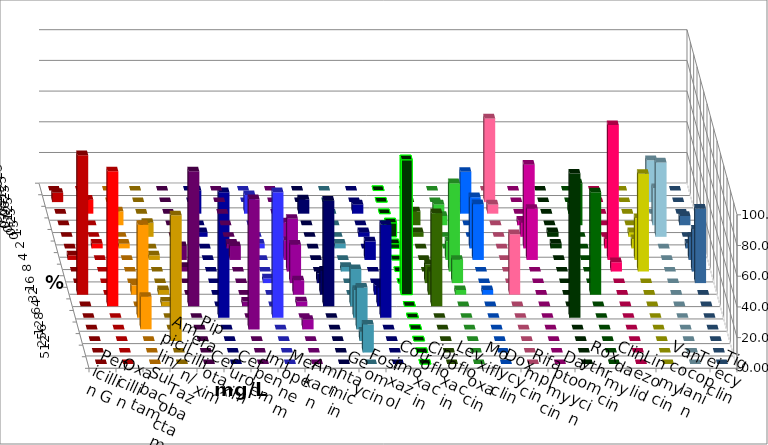
| Category | Penicillin G | Oxacillin | Ampicillin/ Sulbactam | Piperacillin/ Tazobactam | Cefotaxim | Cefuroxim | Imipenem | Meropenem | Amikacin | Gentamicin | Fosfomycin | Cotrimoxazol | Ciprofloxacin | Levofloxacin | Moxifloxacin | Doxycyclin | Rifampicin | Daptomycin | Roxythromycin | Clindamycin | Linezolid | Vancomycin | Teicoplanin | Tigecyclin |
|---|---|---|---|---|---|---|---|---|---|---|---|---|---|---|---|---|---|---|---|---|---|---|---|---|
| 0.015625 | 0 | 0 | 0 | 0 | 0 | 0 | 0 | 0 | 0 | 0 | 0 | 0 | 0 | 0 | 0 | 0 | 0 | 0 | 0 | 0 | 0 | 0 | 0 | 0 |
| 0.03125 | 6.061 | 0 | 0 | 0 | 0 | 0 | 0 | 0 | 0 | 0 | 0 | 0 | 0 | 0 | 0 | 0 | 54.545 | 0 | 0 | 0 | 0 | 0 | 0 | 27.273 |
| 0.0625 | 0 | 9.091 | 0 | 0 | 0 | 0 | 15.152 | 12.121 | 0 | 9.375 | 0 | 6.061 | 0 | 0 | 6.061 | 27.273 | 6.061 | 0 | 0 | 6.061 | 0 | 0 | 0 | 0 |
| 0.125 | 0 | 0 | 9.091 | 0 | 0 | 0 | 0 | 0 | 0 | 0 | 0 | 0 | 0 | 9.091 | 6.061 | 0 | 0 | 3.03 | 0 | 27.273 | 0 | 0 | 6.061 | 24.242 |
| 0.25 | 0 | 0 | 0 | 9.091 | 0 | 0 | 3.03 | 0 | 9.375 | 0 | 0 | 3.03 | 9.091 | 3.03 | 0 | 0 | 0 | 9.091 | 3.03 | 0 | 0 | 3.03 | 0 | 48.485 |
| 0.5 | 0 | 3.03 | 3.03 | 0 | 0 | 3.03 | 0 | 3.03 | 0 | 0 | 3.03 | 0 | 3.03 | 0 | 0 | 33.333 | 0 | 54.545 | 3.03 | 0 | 6.061 | 6.061 | 3.03 | 0 |
| 1.0 | 3.03 | 0 | 0 | 3.03 | 9.091 | 9.091 | 0 | 0 | 12.5 | 0 | 0 | 12.121 | 0 | 0 | 12.121 | 36.364 | 0 | 33.333 | 0 | 0 | 87.879 | 27.273 | 15.152 | 0 |
| 2.0 | 0 | 0 | 0 | 0 | 3.03 | 0 | 0 | 0 | 34.375 | 0 | 3.03 | 0 | 0 | 0 | 57.576 | 0 | 0 | 0 | 0 | 0 | 6.061 | 63.636 | 27.273 | 0 |
| 4.0 | 0 | 0 | 0 | 0 | 0 | 0 | 0 | 3.03 | 25 | 6.25 | 0 | 0 | 0 | 12.121 | 15.152 | 0 | 0 | 0 | 0 | 0 | 0 | 0 | 48.485 | 0 |
| 8.0 | 90.909 | 0 | 6.061 | 3.03 | 0 | 0 | 0 | 0 | 9.375 | 15.625 | 0 | 6.061 | 87.879 | 15.152 | 3.03 | 3.03 | 39.394 | 0 | 0 | 66.667 | 0 | 0 | 0 | 0 |
| 16.0 | 0 | 87.879 | 0 | 3.03 | 87.879 | 3.03 | 0 | 0 | 3.125 | 68.75 | 24.242 | 12.121 | 0 | 60.606 | 0 | 0 | 0 | 0 | 0 | 0 | 0 | 0 | 0 | 0 |
| 32.0 | 0 | 0 | 60.606 | 0 | 0 | 0 | 81.818 | 81.818 | 0 | 0 | 18.182 | 60.606 | 0 | 0 | 0 | 0 | 0 | 0 | 93.939 | 0 | 0 | 0 | 0 | 0 |
| 64.0 | 0 | 0 | 21.212 | 0 | 0 | 84.848 | 0 | 0 | 6.25 | 0 | 27.273 | 0 | 0 | 0 | 0 | 0 | 0 | 0 | 0 | 0 | 0 | 0 | 0 | 0 |
| 128.0 | 0 | 0 | 0 | 81.818 | 0 | 0 | 0 | 0 | 0 | 0 | 6.061 | 0 | 0 | 0 | 0 | 0 | 0 | 0 | 0 | 0 | 0 | 0 | 0 | 0 |
| 256.0 | 0 | 0 | 0 | 0 | 0 | 0 | 0 | 0 | 0 | 0 | 18.182 | 0 | 0 | 0 | 0 | 0 | 0 | 0 | 0 | 0 | 0 | 0 | 0 | 0 |
| 512.0 | 0 | 0 | 0 | 0 | 0 | 0 | 0 | 0 | 0 | 0 | 0 | 0 | 0 | 0 | 0 | 0 | 0 | 0 | 0 | 0 | 0 | 0 | 0 | 0 |